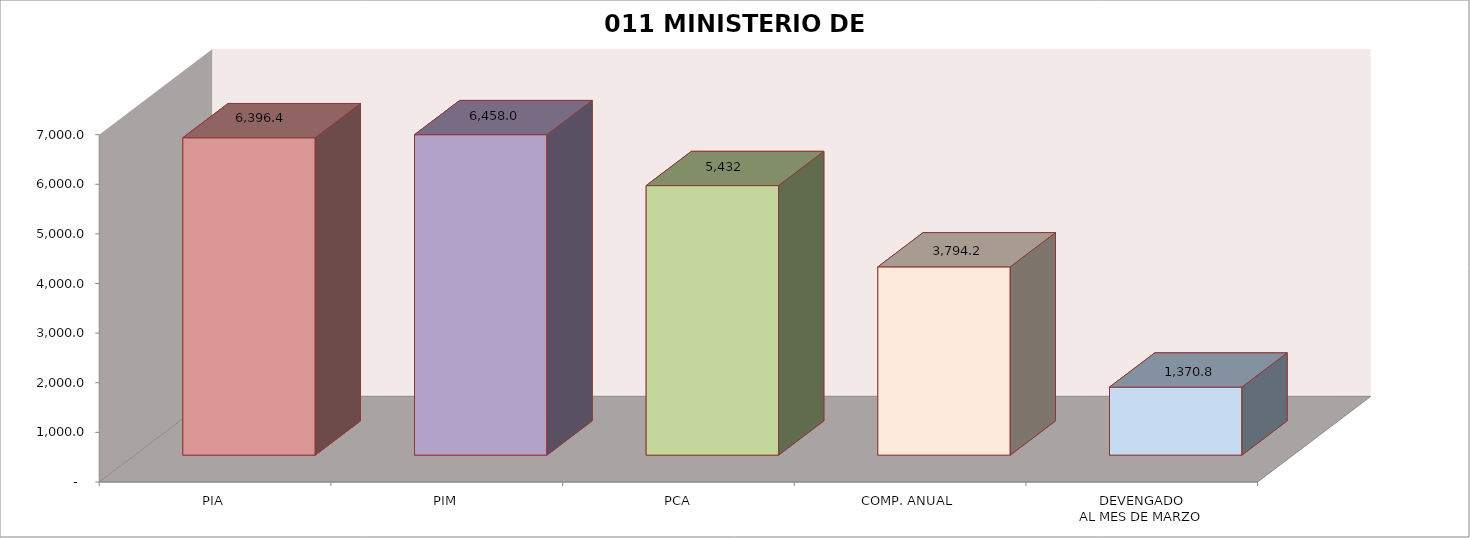
| Category | 011 MINISTERIO DE SALUD |
|---|---|
| PIA | 6396.414 |
| PIM | 6457.959 |
| PCA | 5432.206 |
| COMP. ANUAL | 3794.169 |
| DEVENGADO
AL MES DE MARZO | 1370.823 |